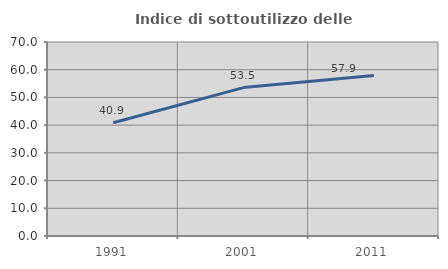
| Category | Indice di sottoutilizzo delle abitazioni  |
|---|---|
| 1991.0 | 40.876 |
| 2001.0 | 53.546 |
| 2011.0 | 57.931 |